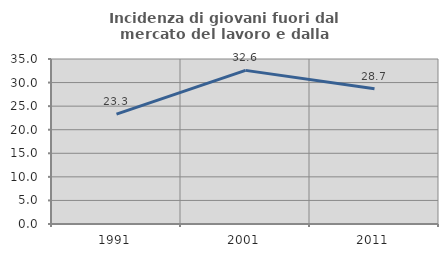
| Category | Incidenza di giovani fuori dal mercato del lavoro e dalla formazione  |
|---|---|
| 1991.0 | 23.319 |
| 2001.0 | 32.587 |
| 2011.0 | 28.702 |